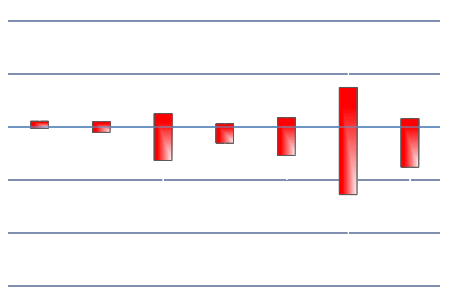
| Category | Series 0 | Series 1 | Series 2 | Series 3 |
|---|---|---|---|---|
| FVAM7 | 0.001 | 0.001 | -0.001 | 0 |
| TYAM7 | 0.001 | 0.001 | -0.002 | -0.001 |
| USAM7 | 0.001 | 0.002 | -0.006 | -0.003 |
| DLM7 | 0 | 0.001 | -0.002 | -0.002 |
| DBM7 | 0.001 | 0.002 | -0.005 | -0.003 |
| FGBXM7 | 0.004 | 0.007 | -0.013 | -0.006 |
| QGAM7 | 0.001 | 0.001 | -0.008 | -0.004 |